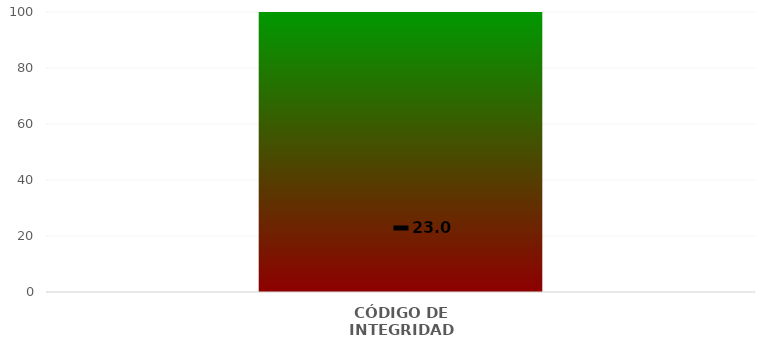
| Category | Niveles |
|---|---|
| CÓDIGO DE INTEGRIDAD | 100 |